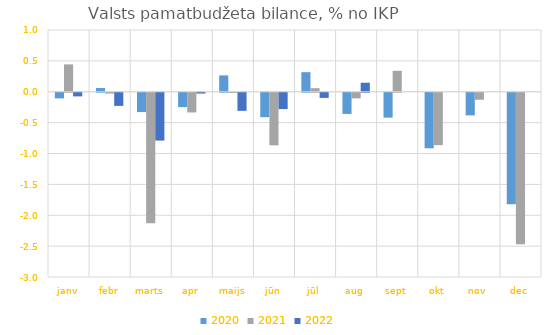
| Category | 2020 | 2021 | 2022 |
|---|---|---|---|
| janv | -0.092 | 0.443 | -0.059 |
| febr | 0.06 | -0.014 | -0.213 |
| marts | -0.313 | -2.113 | -0.775 |
| apr | -0.233 | -0.319 | -0.013 |
| maijs | 0.265 | -0.004 | -0.293 |
| jūn | -0.395 | -0.851 | -0.264 |
| jūl | 0.317 | 0.058 | -0.083 |
| aug | -0.343 | -0.091 | 0.146 |
| sept | -0.403 | 0.339 | 0 |
| okt | -0.9 | -0.848 | 0 |
| nov | -0.367 | -0.113 | 0 |
| dec | -1.806 | -2.452 | 0 |